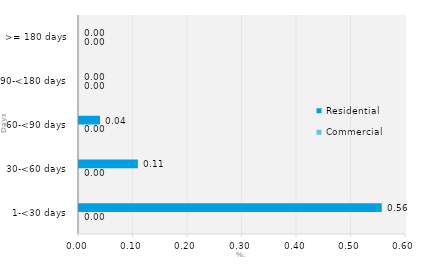
| Category | Commercial | Residential |
|---|---|---|
| 1-<30 days | 0 | 0.555 |
| 30-<60 days | 0 | 0.108 |
| 60-<90 days | 0 | 0.039 |
| 90-<180 days | 0 | 0 |
| >= 180 days | 0 | 0 |